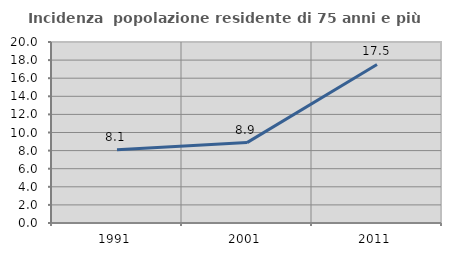
| Category | Incidenza  popolazione residente di 75 anni e più |
|---|---|
| 1991.0 | 8.086 |
| 2001.0 | 8.882 |
| 2011.0 | 17.521 |